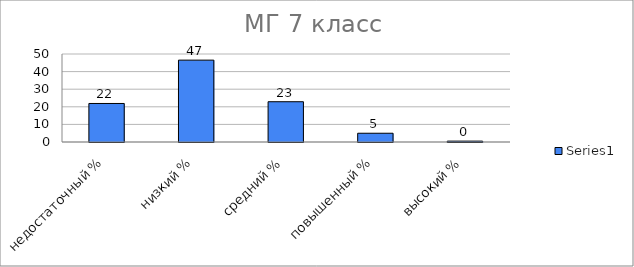
| Category | Series 0 |
|---|---|
| недостаточный % | 21.891 |
| низкий % | 46.517 |
| средний % | 22.886 |
| повышенный % | 4.975 |
| высокий % | 0.498 |